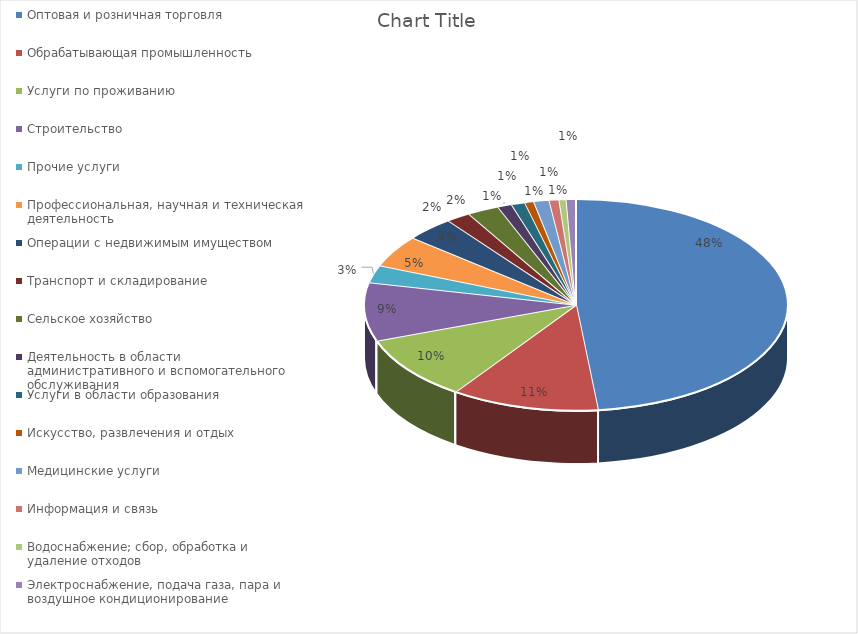
| Category | Series 0 |
|---|---|
| Оптовая и розничная торговля | 0.483 |
| Обрабатывающая промышленность | 0.113 |
| Услуги по проживанию | 0.099 |
| Строительство | 0.089 |
| Прочие услуги | 0.027 |
| Профессиональная, научная и техническая деятельность | 0.049 |
| Операции с недвижимым имуществом | 0.037 |
| Транспорт и складирование | 0.018 |
| Сельское хозяйство | 0.024 |
| Деятельность в области административного и вспомогательного обслуживания | 0.011 |
| Услуги в области образования | 0.01 |
| Искусство, развлечения и отдых | 0.007 |
| Медицинские услуги | 0.012 |
| Информация и связь | 0.008 |
| Водоснабжение; сбор, обработка и удаление отходов | 0.005 |
| Электроснабжение, подача газа, пара и воздушное кондиционирование | 0.007 |